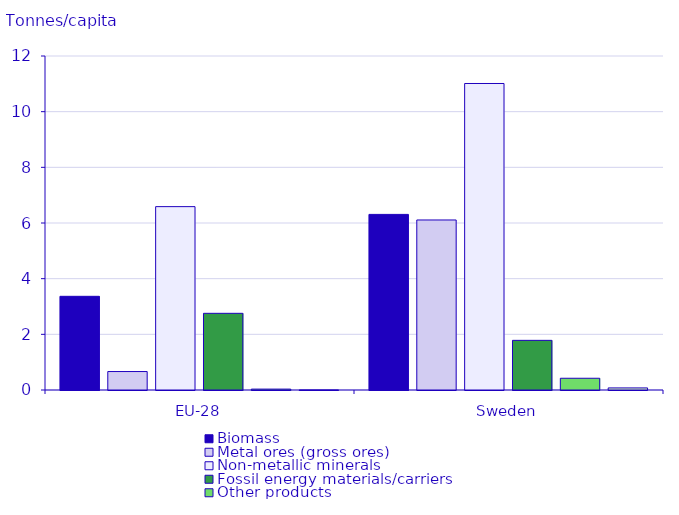
| Category | Biomass | Metal ores (gross ores) | Non-metallic minerals | Fossil energy materials/carriers | Other products | Waste for final treatment and disposal |
|---|---|---|---|---|---|---|
| EU-28 | 3.366 | 0.663 | 6.588 | 2.755 | 0.032 | 0.002 |
| Sweden | 6.309 | 6.109 | 11.012 | 1.784 | 0.422 | 0.075 |